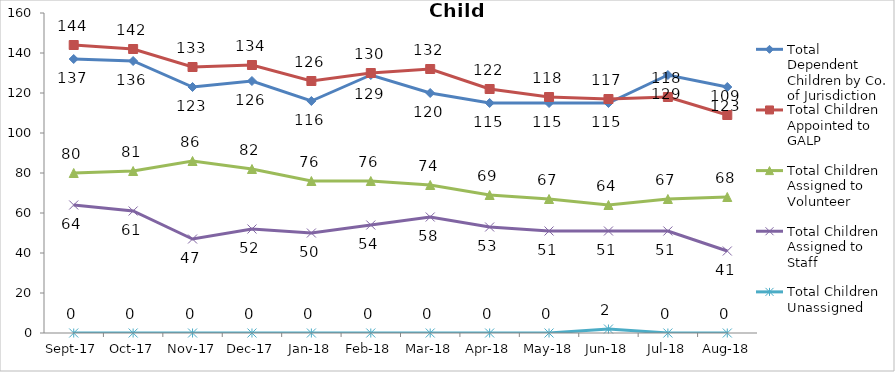
| Category | Total Dependent Children by Co. of Jurisdiction | Total Children Appointed to GALP | Total Children Assigned to Volunteer | Total Children Assigned to Staff | Total Children Unassigned |
|---|---|---|---|---|---|
| 2017-09-01 | 137 | 144 | 80 | 64 | 0 |
| 2017-10-01 | 136 | 142 | 81 | 61 | 0 |
| 2017-11-01 | 123 | 133 | 86 | 47 | 0 |
| 2017-12-01 | 126 | 134 | 82 | 52 | 0 |
| 2018-01-01 | 116 | 126 | 76 | 50 | 0 |
| 2018-02-01 | 129 | 130 | 76 | 54 | 0 |
| 2018-03-01 | 120 | 132 | 74 | 58 | 0 |
| 2018-04-01 | 115 | 122 | 69 | 53 | 0 |
| 2018-05-01 | 115 | 118 | 67 | 51 | 0 |
| 2018-06-01 | 115 | 117 | 64 | 51 | 2 |
| 2018-07-01 | 129 | 118 | 67 | 51 | 0 |
| 2018-08-01 | 123 | 109 | 68 | 41 | 0 |